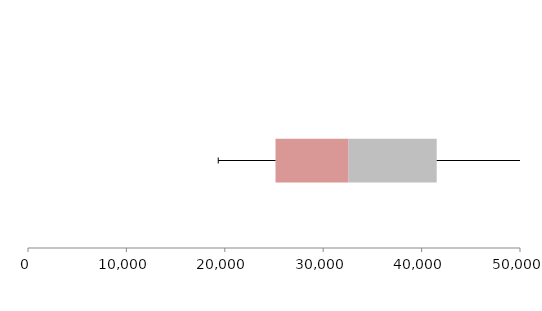
| Category | Series 1 | Series 2 | Series 3 |
|---|---|---|---|
| 0 | 25155.688 | 7424.374 | 8952.863 |